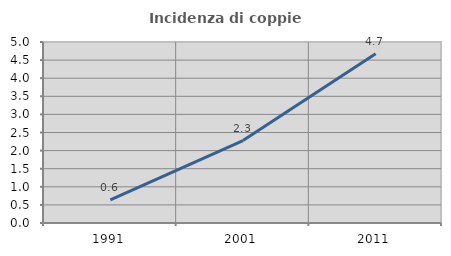
| Category | Incidenza di coppie miste |
|---|---|
| 1991.0 | 0.639 |
| 2001.0 | 2.276 |
| 2011.0 | 4.673 |